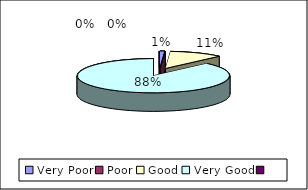
| Category | How would you rate the attitude of staff |
|---|---|
| Very Poor | 1 |
| Poor | 0 |
| Good | 11 |
| Very Good | 85 |